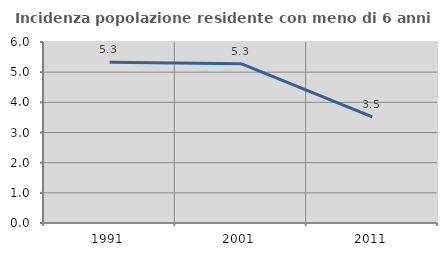
| Category | Incidenza popolazione residente con meno di 6 anni |
|---|---|
| 1991.0 | 5.332 |
| 2001.0 | 5.28 |
| 2011.0 | 3.515 |